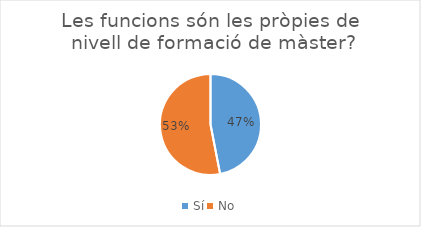
| Category | Series 0 |
|---|---|
| Sí | 92 |
| No | 104 |